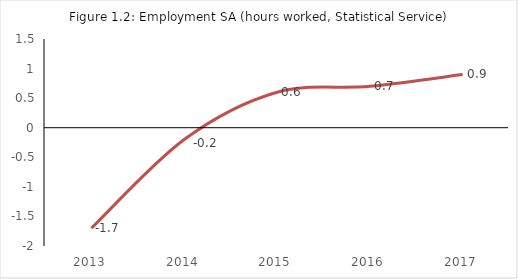
| Category | Employment SA (hours worked, Statistical Service) |
|---|---|
| 2013.0 | -1.7 |
| 2014.0 | -0.2 |
| 2015.0 | 0.6 |
| 2016.0 | 0.7 |
| 2017.0 | 0.9 |